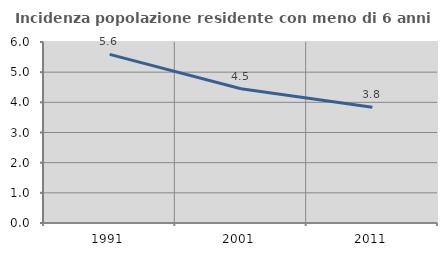
| Category | Incidenza popolazione residente con meno di 6 anni |
|---|---|
| 1991.0 | 5.591 |
| 2001.0 | 4.452 |
| 2011.0 | 3.839 |